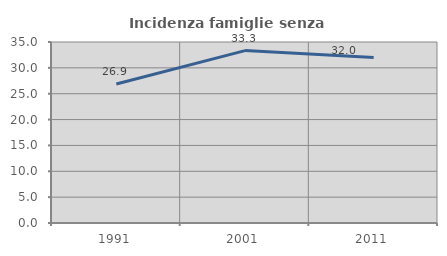
| Category | Incidenza famiglie senza nuclei |
|---|---|
| 1991.0 | 26.866 |
| 2001.0 | 33.333 |
| 2011.0 | 32 |